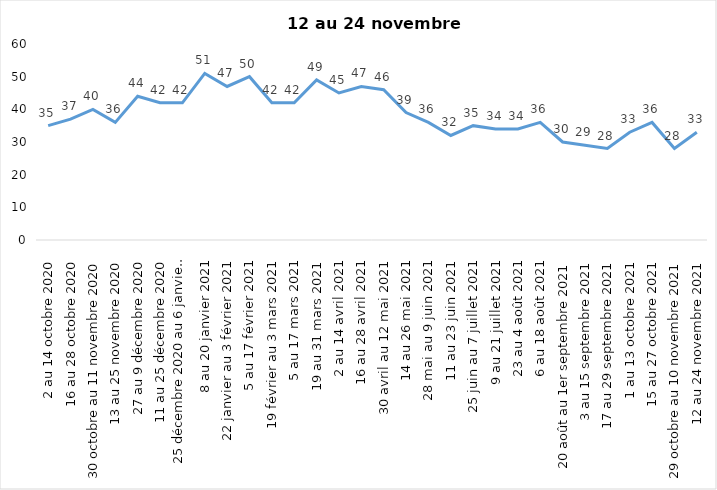
| Category | Toujours aux trois mesures |
|---|---|
| 2 au 14 octobre 2020 | 35 |
| 16 au 28 octobre 2020 | 37 |
| 30 octobre au 11 novembre 2020 | 40 |
| 13 au 25 novembre 2020 | 36 |
| 27 au 9 décembre 2020 | 44 |
| 11 au 25 décembre 2020 | 42 |
| 25 décembre 2020 au 6 janvier 2021 | 42 |
| 8 au 20 janvier 2021 | 51 |
| 22 janvier au 3 février 2021 | 47 |
| 5 au 17 février 2021 | 50 |
| 19 février au 3 mars 2021 | 42 |
| 5 au 17 mars 2021 | 42 |
| 19 au 31 mars 2021 | 49 |
| 2 au 14 avril 2021 | 45 |
| 16 au 28 avril 2021 | 47 |
| 30 avril au 12 mai 2021 | 46 |
| 14 au 26 mai 2021 | 39 |
| 28 mai au 9 juin 2021 | 36 |
| 11 au 23 juin 2021 | 32 |
| 25 juin au 7 juillet 2021 | 35 |
| 9 au 21 juillet 2021 | 34 |
| 23 au 4 août 2021 | 34 |
| 6 au 18 août 2021 | 36 |
| 20 août au 1er septembre 2021 | 30 |
| 3 au 15 septembre 2021 | 29 |
| 17 au 29 septembre 2021 | 28 |
| 1 au 13 octobre 2021 | 33 |
| 15 au 27 octobre 2021 | 36 |
| 29 octobre au 10 novembre 2021 | 28 |
| 12 au 24 novembre 2021 | 33 |